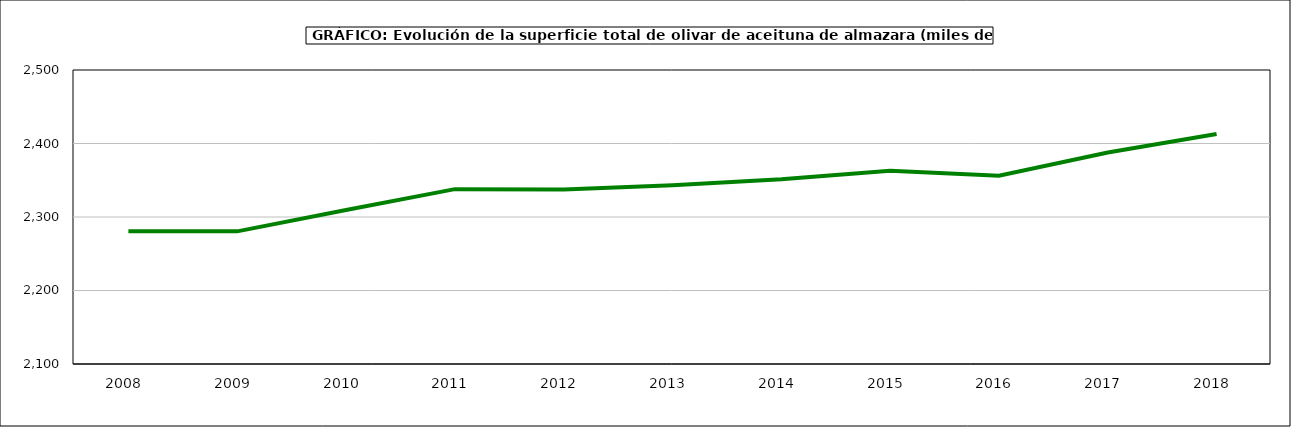
| Category | superficie |
|---|---|
| 2008.0 | 2280.579 |
| 2009.0 | 2280.456 |
| 2010.0 | 2309.46 |
| 2011.0 | 2337.913 |
| 2012.0 | 2337.582 |
| 2013.0 | 2343.184 |
| 2014.0 | 2351.428 |
| 2015.0 | 2363.082 |
| 2016.0 | 2356.047 |
| 2017.0 | 2387.832 |
| 2018.0 | 2413.021 |